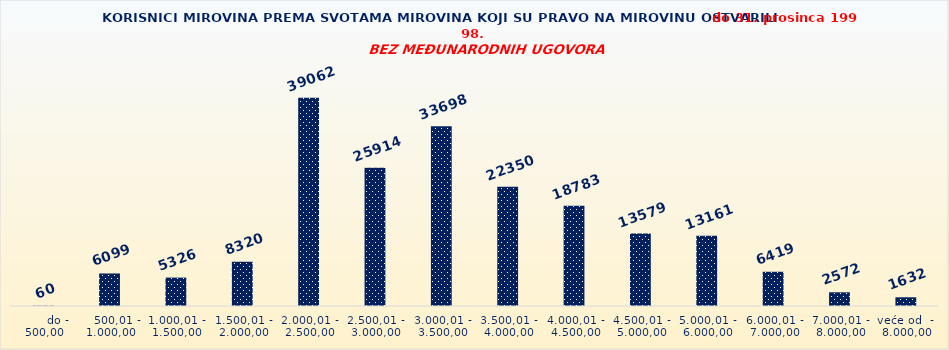
| Category | Series 0 |
|---|---|
|       do - 500,00 | 60 |
|    500,01 - 1.000,00 | 6099 |
| 1.000,01 - 1.500,00 | 5326 |
| 1.500,01 - 2.000,00 | 8320 |
| 2.000,01 - 2.500,00 | 39062 |
| 2.500,01 - 3.000,00 | 25914 |
| 3.000,01 - 3.500,00 | 33698 |
| 3.500,01 - 4.000,00 | 22350 |
| 4.000,01 - 4.500,00 | 18783 |
| 4.500,01 - 5.000,00 | 13579 |
| 5.000,01 - 6.000,00 | 13161 |
| 6.000,01 - 7.000,00 | 6419 |
| 7.000,01 - 8.000,00 | 2572 |
| veće od  -  8.000,00 | 1632 |